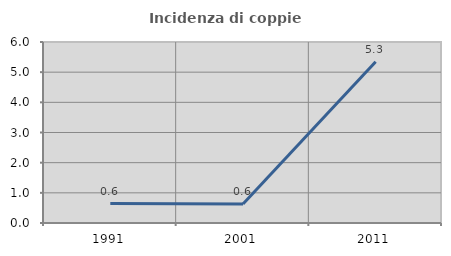
| Category | Incidenza di coppie miste |
|---|---|
| 1991.0 | 0.646 |
| 2001.0 | 0.629 |
| 2011.0 | 5.344 |